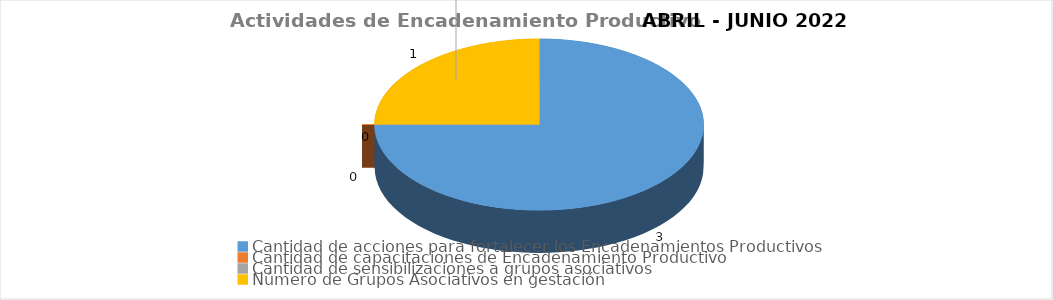
| Category | Series 0 |
|---|---|
| Cantidad de acciones para fortalecer los Encadenamientos Productivos | 3 |
| Cantidad de capacitaciones de Encadenamiento Productivo | 0 |
| Cantidad de sensibilizaciones a grupos asociativos | 0 |
| Número de Grupos Asociativos en gestación | 1 |